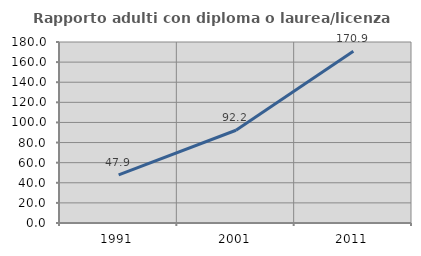
| Category | Rapporto adulti con diploma o laurea/licenza media  |
|---|---|
| 1991.0 | 47.917 |
| 2001.0 | 92.241 |
| 2011.0 | 170.874 |